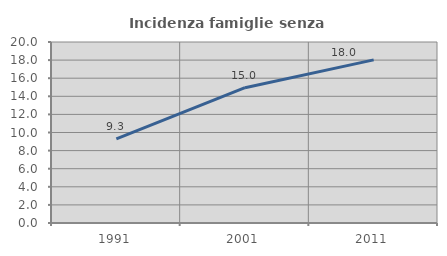
| Category | Incidenza famiglie senza nuclei |
|---|---|
| 1991.0 | 9.301 |
| 2001.0 | 14.951 |
| 2011.0 | 18.024 |